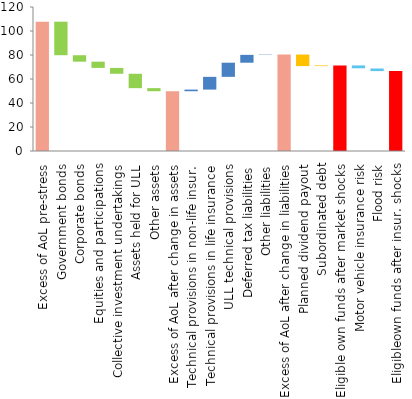
| Category | Series 0 | Series 1 |
|---|---|---|
| Excess of AoL pre-stress | 107.78 | 0 |
| Government bonds | 79.81 | 27.96 |
| Corporate bonds | 74.44 | 5.37 |
| Equities and participations | 69.23 | 5.21 |
| Collective investment undertakings | 64.36 | 4.87 |
| Assets held for ULL | 52.37 | 11.99 |
| Other assets | 49.81 | 2.56 |
| Excess of AoL after change in assets | 0 | 49.81 |
| Technical provisions in non-life insur. | 49.81 | 1.36 |
| Technical provisions in life insurance | 51.17 | 10.62 |
| ULL technical provisions | 61.79 | 11.78 |
| Deferred tax liabilities | 73.57 | 6.55 |
| Other liabilities | 80.13 | 0.26 |
| Excess of AoL after change in liabilities | 0 | 80.39 |
| Planned dividend payout | 70.75 | 9.63 |
| Subordinated debt | 70.75 | 0.56 |
| Eligible own funds after market shocks | 0 | 71.31 |
| Motor vehicle insurance risk | 68.95 | 2.36 |
| Flood risk | 66.6 | 2.16 |
| Eligibleown funds after insur. shocks | 0 | 66.6 |